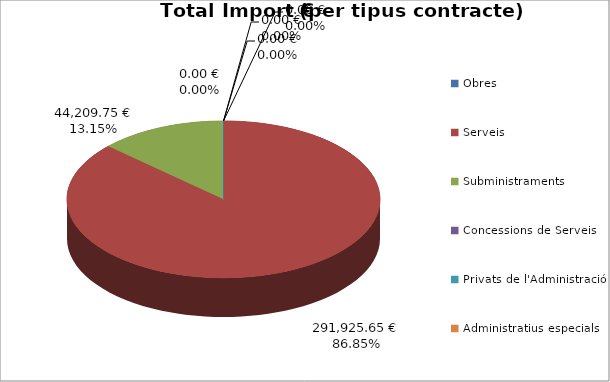
| Category | Total preu              (amb iva) |
|---|---|
| Obres | 0 |
| Serveis | 291925.65 |
| Subministraments | 44209.75 |
| Concessions de Serveis | 0 |
| Privats de l'Administració | 0 |
| Administratius especials | 0 |